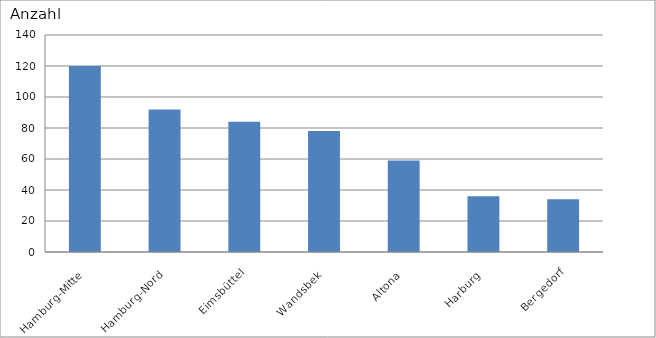
| Category | Hamburg-Mitte |
|---|---|
| Hamburg-Mitte | 120 |
| Hamburg-Nord | 92 |
| Eimsbüttel | 84 |
| Wandsbek | 78 |
| Altona | 59 |
| Harburg | 36 |
| Bergedorf | 34 |